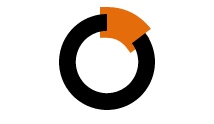
| Category | Series 0 |
|---|---|
| 0 | 0.147 |
| 1 | 0.853 |